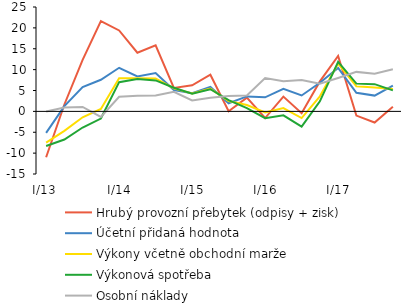
| Category | Hrubý provozní přebytek (odpisy + zisk)   | Účetní přidaná hodnota | Výkony včetně obchodní marže | Výkonová spotřeba | Osobní náklady |
|---|---|---|---|---|---|
| I/13 | -10.985 | -5.139 | -7.467 | -8.299 | -0.029 |
| II | 1.651 | 1.266 | -4.677 | -6.746 | 0.952 |
| III | 12.354 | 5.83 | -1.408 | -3.867 | 1.073 |
| IV | 21.633 | 7.569 | 0.561 | -1.724 | -1.317 |
|  I/14 | 19.377 | 10.443 | 7.927 | 6.996 | 3.489 |
| II | 14.056 | 8.377 | 7.929 | 7.759 | 3.715 |
| III | 15.807 | 9.164 | 7.897 | 7.423 | 3.778 |
| IV | 5.608 | 5.099 | 5.518 | 5.667 | 4.703 |
|  I/15 | 6.258 | 4.33 | 4.267 | 4.242 | 2.6 |
|  II | 8.779 | 5.885 | 5.463 | 5.302 | 3.274 |
| III | 0.02 | 1.943 | 2.472 | 2.674 | 3.683 |
| IV | 3.287 | 3.585 | 1.515 | 0.78 | 3.819 |
|  I/16 | -1.596 | 3.373 | -0.248 | -1.632 | 7.994 |
| II | 3.541 | 5.412 | 0.805 | -0.957 | 7.192 |
| III | -0.43 | 3.809 | -1.61 | -3.654 | 7.507 |
| IV | 7.176 | 6.856 | 3.599 | 2.411 | 6.605 |
|  I/17 | 13.273 | 10.409 | 11.463 | 11.886 | 7.982 |
| II | -1.012 | 4.445 | 6.009 | 6.646 | 9.458 |
| III | -2.678 | 3.78 | 5.728 | 6.519 | 9 |
| IV | 1.133 | 6.149 | 5.336 | 5.027 | 10.09 |